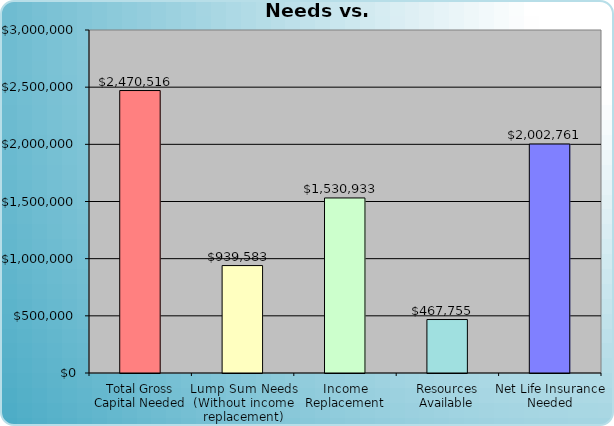
| Category | Series 0 |
|---|---|
| Total Gross Capital Needed | 2470515.914 |
| Lump Sum Needs (Without income replacement) | 939583.285 |
| Income Replacement | 1530932.629 |
| Resources Available | 467755 |
| Net Life Insurance Needed | 2002760.914 |